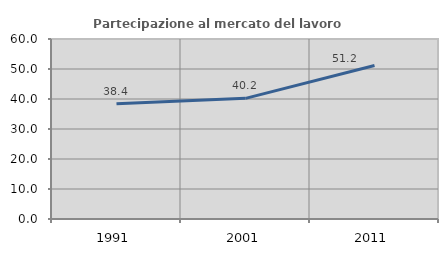
| Category | Partecipazione al mercato del lavoro  femminile |
|---|---|
| 1991.0 | 38.433 |
| 2001.0 | 40.221 |
| 2011.0 | 51.163 |